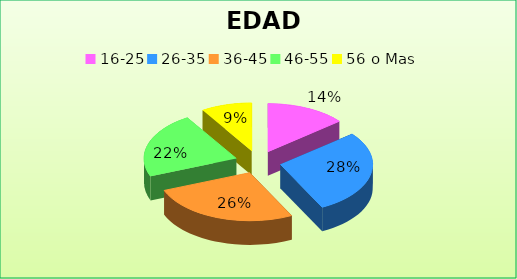
| Category | Series 0 |
|---|---|
| 16-25 | 0.141 |
| 26-35 | 0.284 |
| 36-45 | 0.264 |
| 46-55 | 0.221 |
| 56 o Mas | 0.089 |